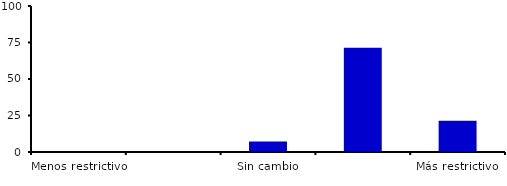
| Category | Series 0 |
|---|---|
| Menos restrictivo | 0 |
| Moderadamente menos restrictivo | 0 |
| Sin cambio | 7.143 |
| Moderadamente más restrictivo | 71.429 |
| Más restrictivo | 21.429 |